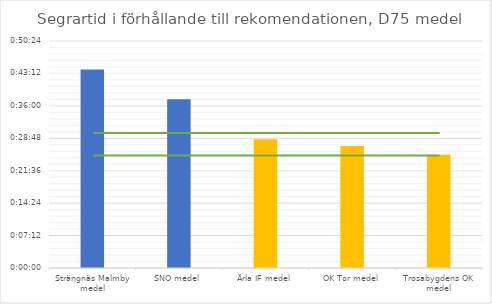
| Category | D75 tid |
|---|---|
| Strängnäs Malmby medel | 0.031 |
| SNO medel | 0.026 |
| Ärla IF medel | 0.02 |
| OK Tor medel | 0.019 |
| Trosabygdens OK medel | 0.017 |